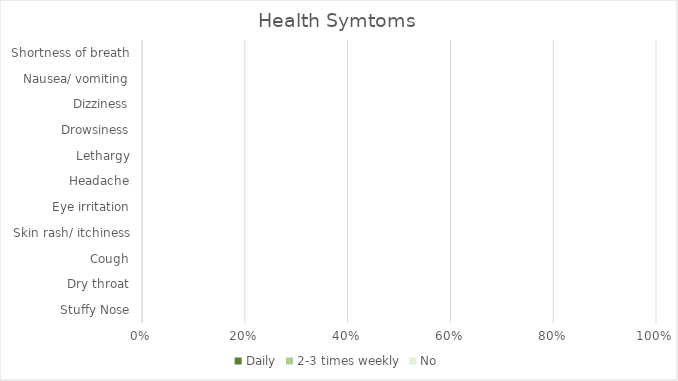
| Category | Daily | 2-3 times weekly | No |
|---|---|---|---|
| Stuffy Nose | 0 | 0 | 0 |
| Dry throat | 0 | 0 | 0 |
| Cough | 0 | 0 | 0 |
| Skin rash/ itchiness | 0 | 0 | 0 |
| Eye irritation | 0 | 0 | 0 |
| Headache | 0 | 0 | 0 |
| Lethargy | 0 | 0 | 0 |
| Drowsiness | 0 | 0 | 0 |
| Dizziness | 0 | 0 | 0 |
| Nausea/ vomiting | 0 | 0 | 0 |
| Shortness of breath | 0 | 0 | 0 |